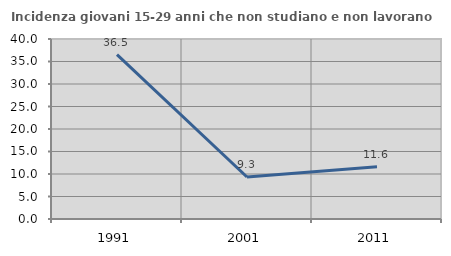
| Category | Incidenza giovani 15-29 anni che non studiano e non lavorano  |
|---|---|
| 1991.0 | 36.508 |
| 2001.0 | 9.338 |
| 2011.0 | 11.623 |